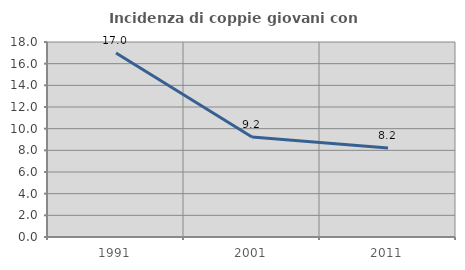
| Category | Incidenza di coppie giovani con figli |
|---|---|
| 1991.0 | 16.981 |
| 2001.0 | 9.237 |
| 2011.0 | 8.214 |